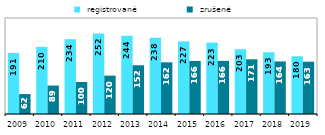
| Category |  registrované |  zrušené  |
|---|---|---|
| 2009.0 | 190.681 | 62.26 |
| 2010.0 | 209.884 | 88.928 |
| 2011.0 | 233.879 | 100.006 |
| 2012.0 | 251.778 | 119.878 |
| 2013.0 | 244.427 | 152.236 |
| 2014.0 | 238.101 | 161.545 |
| 2015.0 | 226.685 | 165.583 |
| 2016.0 | 223.142 | 165.982 |
| 2017.0 | 202.662 | 170.874 |
| 2018.0 | 192.915 | 164.171 |
| 2019.0 | 180.337 | 163.337 |